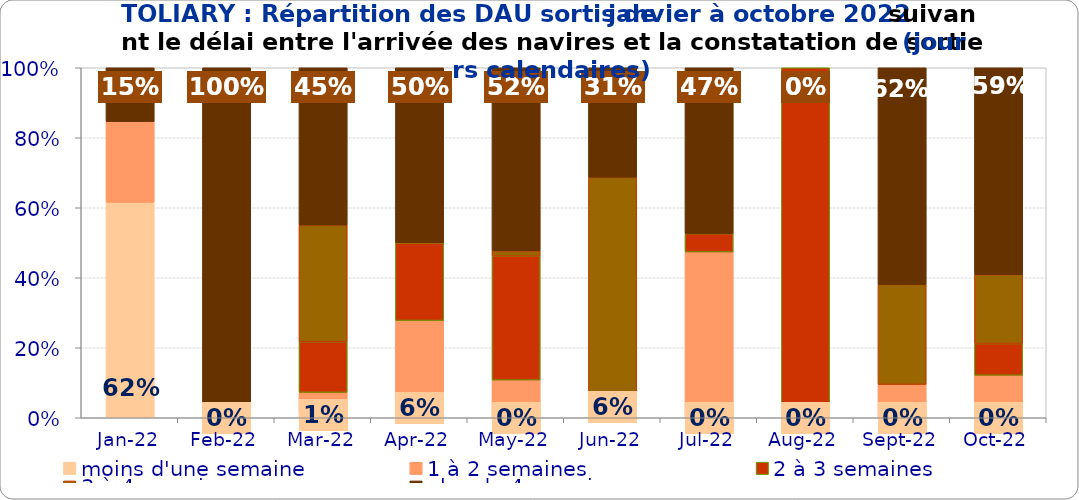
| Category | moins d'une semaine | 1 à 2 semaines | 2 à 3 semaines | 3 à 4 semaines | plus de 4 semaines |
|---|---|---|---|---|---|
| 2022-01-01 | 0.615 | 0.231 | 0 | 0 | 0.154 |
| 2022-02-01 | 0 | 0 | 0 | 0 | 1 |
| 2022-03-01 | 0.014 | 0.058 | 0.145 | 0.333 | 0.449 |
| 2022-04-01 | 0.056 | 0.222 | 0.222 | 0 | 0.5 |
| 2022-05-01 | 0 | 0.108 | 0.354 | 0.015 | 0.523 |
| 2022-06-01 | 0.062 | 0 | 0 | 0.625 | 0.312 |
| 2022-07-01 | 0 | 0.474 | 0.053 | 0 | 0.474 |
| 2022-08-01 | 0 | 0 | 1 | 0 | 0 |
| 2022-09-01 | 0 | 0.095 | 0 | 0.286 | 0.619 |
| 2022-10-01 | 0 | 0.121 | 0.091 | 0.197 | 0.591 |